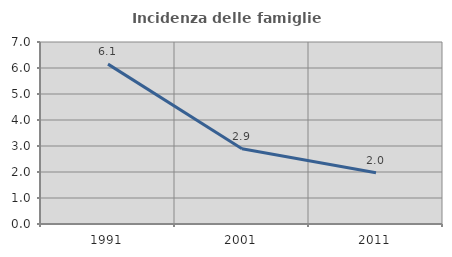
| Category | Incidenza delle famiglie numerose |
|---|---|
| 1991.0 | 6.148 |
| 2001.0 | 2.898 |
| 2011.0 | 1.974 |